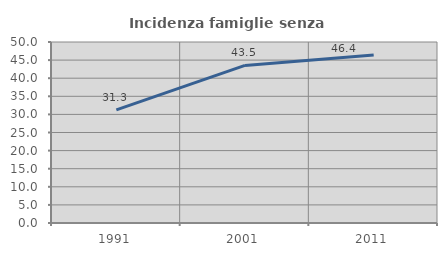
| Category | Incidenza famiglie senza nuclei |
|---|---|
| 1991.0 | 31.25 |
| 2001.0 | 43.522 |
| 2011.0 | 46.382 |